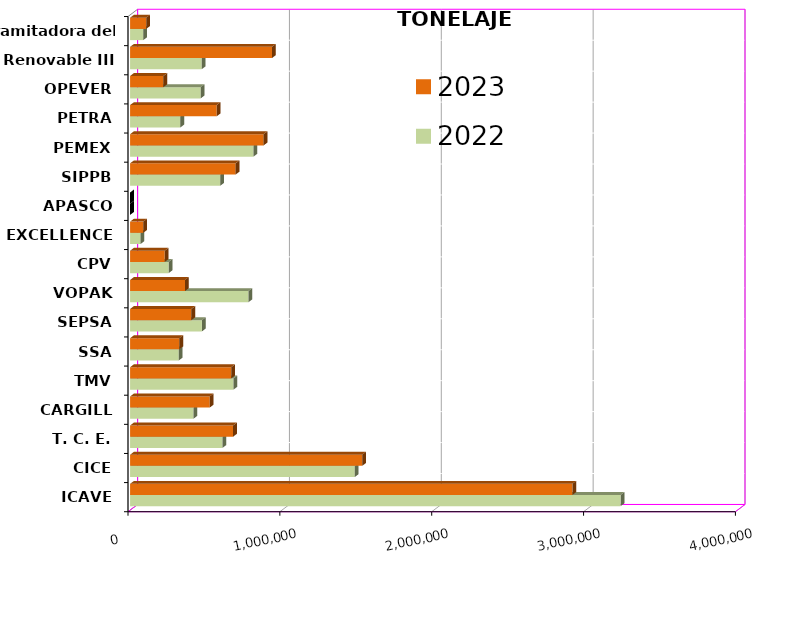
| Category | 2022 | 2023 |
|---|---|---|
| ICAVE | 3230375.36 | 2912855.15 |
| CICE | 1479574.48 | 1528663.179 |
| T. C. E. | 608229.44 | 678339.881 |
| CARGILL | 417114.79 | 524599.49 |
| TMV | 680691.47 | 665778.58 |
| SSA | 320164.824 | 324477.013 |
| SEPSA | 473139.57 | 403193.38 |
| VOPAK | 779315.355 | 361674.599 |
| CPV | 253916.63 | 227937.246 |
| EXCELLENCE | 68832.577 | 86875.545 |
| APASCO | 0 | 0 |
| SIPPB | 593905.975 | 694806.282 |
| PEMEX | 812666.895 | 879371.184 |
| PETRA | 330726.809 | 570303.461 |
| OPEVER | 465157.172 | 219088.89 |
| ESJ Renovable III | 471640.004 | 934489.235 |
| Tramitadora del Pac. | 86908.886 | 106292.323 |